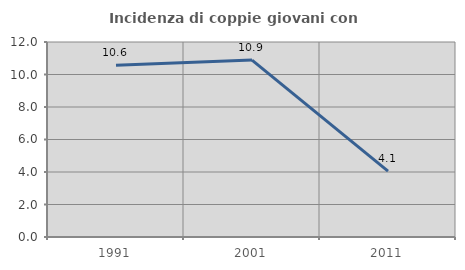
| Category | Incidenza di coppie giovani con figli |
|---|---|
| 1991.0 | 10.569 |
| 2001.0 | 10.887 |
| 2011.0 | 4.054 |